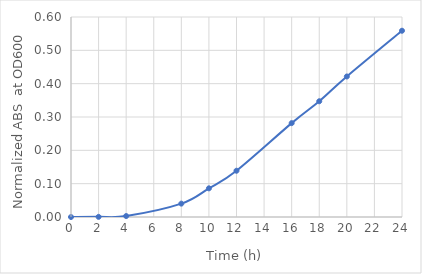
| Category | Series 0 |
|---|---|
| 0.0 | 0 |
| 2.0 | 0 |
| 4.0 | 0.003 |
| 8.0 | 0.04 |
| 10.0 | 0.086 |
| 12.0 | 0.139 |
| 16.0 | 0.282 |
| 18.0 | 0.347 |
| 20.0 | 0.422 |
| 24.0 | 0.559 |